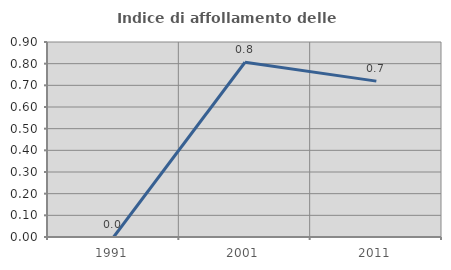
| Category | Indice di affollamento delle abitazioni  |
|---|---|
| 1991.0 | 0 |
| 2001.0 | 0.806 |
| 2011.0 | 0.719 |